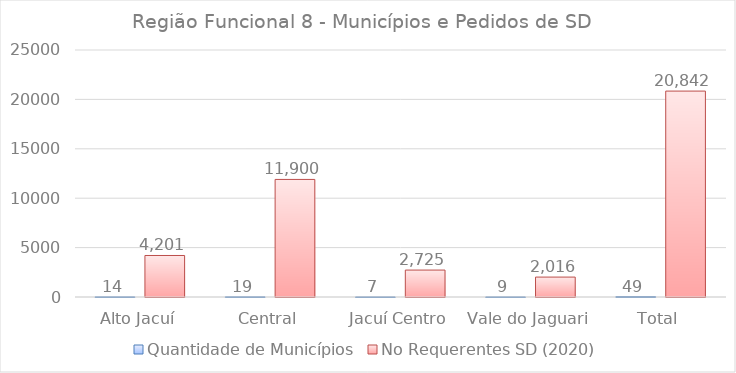
| Category | Quantidade de Municípios | No Requerentes SD (2020) |
|---|---|---|
| Alto Jacuí | 14 | 4201 |
| Central | 19 | 11900 |
| Jacuí Centro | 7 | 2725 |
| Vale do Jaguari | 9 | 2016 |
| Total | 49 | 20842 |